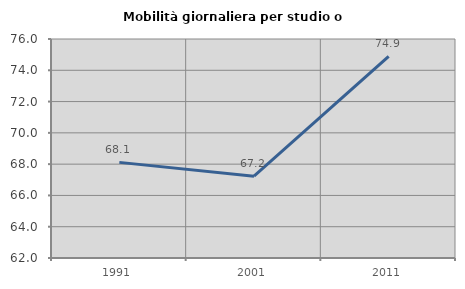
| Category | Mobilità giornaliera per studio o lavoro |
|---|---|
| 1991.0 | 68.113 |
| 2001.0 | 67.233 |
| 2011.0 | 74.886 |